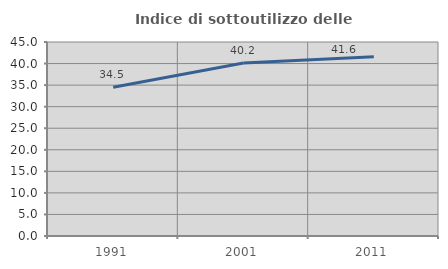
| Category | Indice di sottoutilizzo delle abitazioni  |
|---|---|
| 1991.0 | 34.493 |
| 2001.0 | 40.152 |
| 2011.0 | 41.6 |